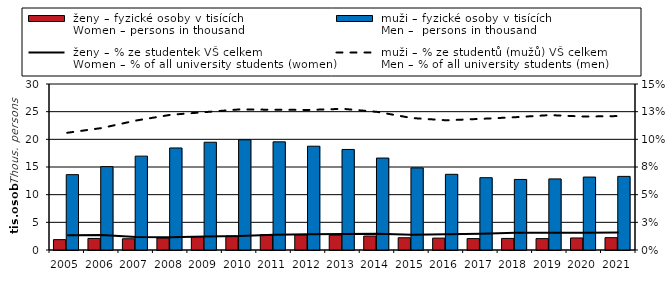
| Category |  ženy – fyzické osoby v tisících
 Women – persons in thousand |  muži – fyzické osoby v tisících
 Men –  persons in thousand |
|---|---|---|
| 2005.0 | 1.875 | 13.617 |
| 2006.0 | 2.092 | 15.067 |
| 2007.0 | 2.032 | 16.963 |
| 2008.0 | 2.153 | 18.442 |
| 2009.0 | 2.417 | 19.474 |
| 2010.0 | 2.532 | 19.919 |
| 2011.0 | 2.766 | 19.548 |
| 2012.0 | 2.736 | 18.757 |
| 2013.0 | 2.676 | 18.171 |
| 2014.0 | 2.525 | 16.616 |
| 2015.0 | 2.212 | 14.844 |
| 2016.0 | 2.151 | 13.677 |
| 2017.0 | 2.063 | 13.067 |
| 2018.0 | 2.094 | 12.751 |
| 2019.0 | 2.06 | 12.849 |
| 2020.0 | 2.177 | 13.182 |
| 2021.0 | 2.231 | 13.304 |